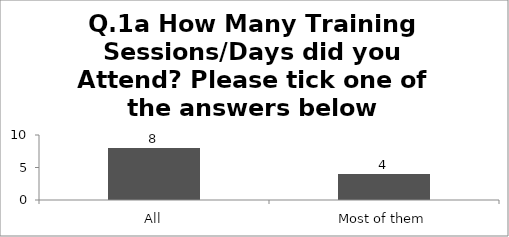
| Category | Q.1a How Many Training Sessions/Days did you Attend? Please tick one of the answers below |
|---|---|
| All | 8 |
| Most of them | 4 |